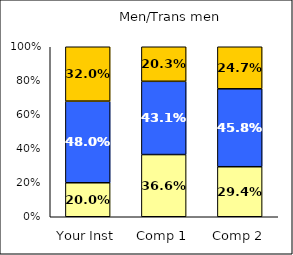
| Category | Low Institutional Priority: Civic Engagement | Average Institutional Priority: Civic Engagement | High Institutional Priority: Civic Engagement |
|---|---|---|---|
| Your Inst | 0.2 | 0.48 | 0.32 |
| Comp 1 | 0.366 | 0.431 | 0.203 |
| Comp 2 | 0.294 | 0.458 | 0.247 |